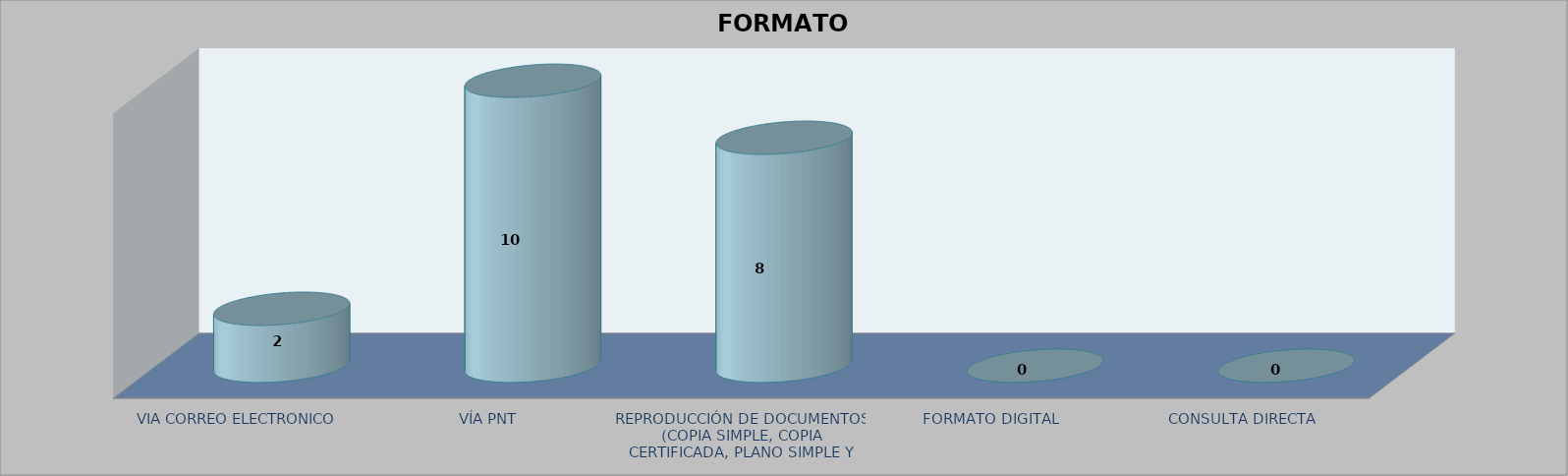
| Category |        FORMATO SOLICITADO | Series 1 | Series 2 |
|---|---|---|---|
| VIA CORREO ELECTRONICO |  |  | 2 |
| VÍA PNT |  |  | 10 |
| REPRODUCCIÓN DE DOCUMENTOS (COPIA SIMPLE, COPIA CERTIFICADA, PLANO SIMPLE Y PLANO CERTIFICADO) |  |  | 8 |
| FORMATO DIGITAL |  |  | 0 |
| CONSULTA DIRECTA |  |  | 0 |